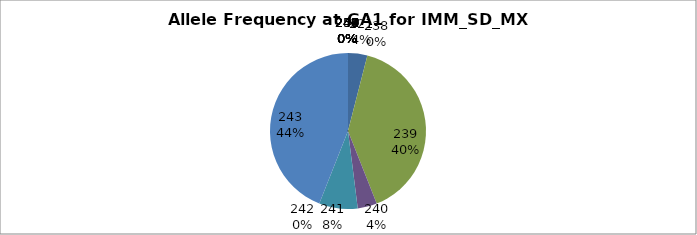
| Category | Series 0 |
|---|---|
| 221.0 | 0.04 |
| 238.0 | 0 |
| 239.0 | 0.4 |
| 240.0 | 0.04 |
| 241.0 | 0.08 |
| 242.0 | 0 |
| 243.0 | 0.44 |
| 244.0 | 0 |
| 245.0 | 0 |
| 246.0 | 0 |
| 247.0 | 0 |
| 248.0 | 0 |
| 249.0 | 0 |
| 250.0 | 0 |
| 251.0 | 0 |
| 253.0 | 0 |